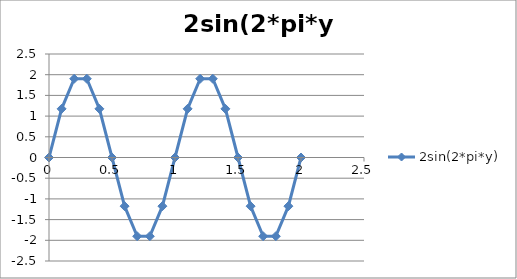
| Category | 2sin(2*pi*y) |
|---|---|
| 0.0 | 0 |
| 0.1 | 1.176 |
| 0.2 | 1.902 |
| 0.30000000000000004 | 1.902 |
| 0.4 | 1.176 |
| 0.5 | 0 |
| 0.6 | -1.176 |
| 0.7 | -1.902 |
| 0.7999999999999999 | -1.902 |
| 0.8999999999999999 | -1.176 |
| 0.9999999999999999 | 0 |
| 1.0999999999999999 | 1.176 |
| 1.2 | 1.902 |
| 1.3 | 1.902 |
| 1.4000000000000001 | 1.176 |
| 1.5000000000000002 | 0 |
| 1.6000000000000003 | -1.176 |
| 1.7000000000000004 | -1.902 |
| 1.8000000000000005 | -1.902 |
| 1.9000000000000006 | -1.176 |
| 2.0000000000000004 | 0 |